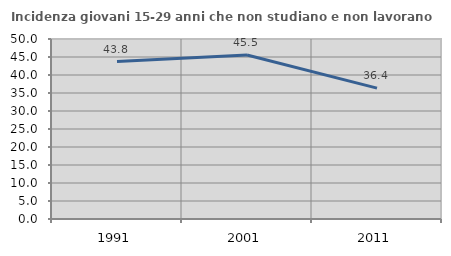
| Category | Incidenza giovani 15-29 anni che non studiano e non lavorano  |
|---|---|
| 1991.0 | 43.75 |
| 2001.0 | 45.536 |
| 2011.0 | 36.364 |